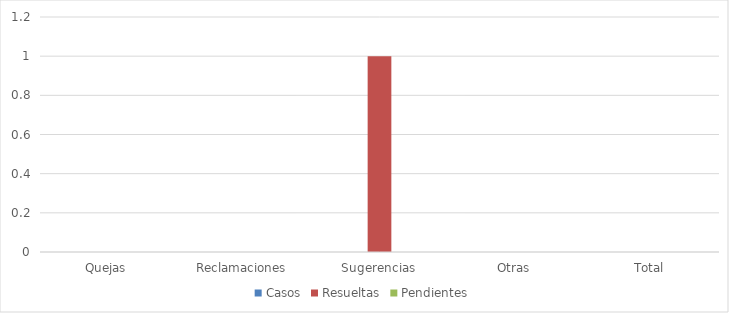
| Category | Casos | Resueltas | Pendientes |
|---|---|---|---|
| Quejas | 0 | 0 | 0 |
| Reclamaciones | 0 | 0 | 0 |
| Sugerencias | 0 | 1 | 0 |
| Otras | 0 | 0 | 0 |
| Total | 0 | 0 | 0 |